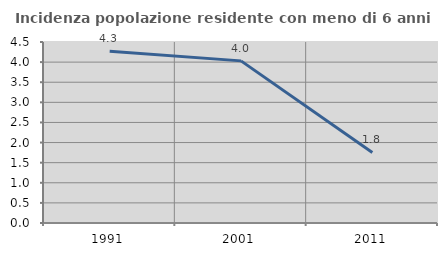
| Category | Incidenza popolazione residente con meno di 6 anni |
|---|---|
| 1991.0 | 4.272 |
| 2001.0 | 4.031 |
| 2011.0 | 1.754 |